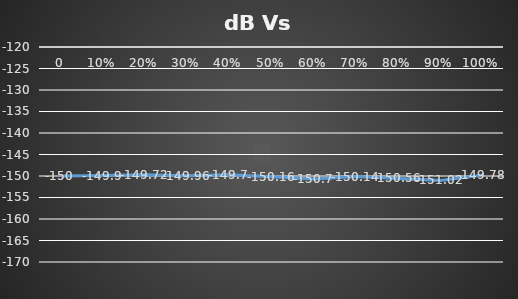
| Category | Series 0 |
|---|---|
| 0.0 | -150 |
| 0.1 | -149.9 |
| 0.2 | -149.72 |
| 0.3 | -149.96 |
| 0.4 | -149.7 |
| 0.5 | -150.16 |
| 0.6 | -150.7 |
| 0.7 | -150.14 |
| 0.8 | -150.56 |
| 0.9 | -151.02 |
| 1.0 | -149.78 |